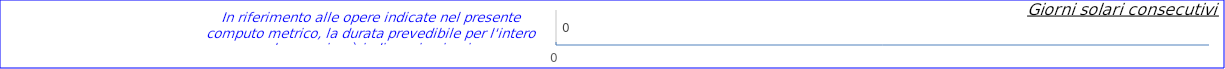
| Category | Series 6 |
|---|---|
| In riferimento alle opere indicate nel presente computo metrico, la durata prevedibile per l'intero lavoro si può indicare in giorni  | 0 |